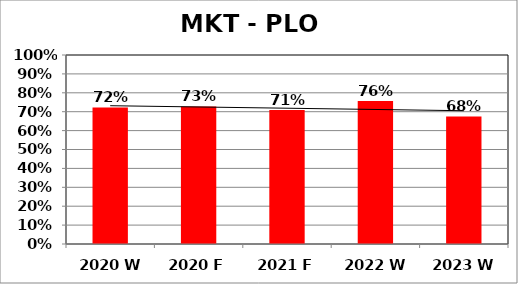
| Category | Series 0 |
|---|---|
| 2020 W | 0.723 |
| 2020 F | 0.728 |
| 2021 F | 0.71 |
| 2022 W | 0.757 |
| 2023 W | 0.675 |